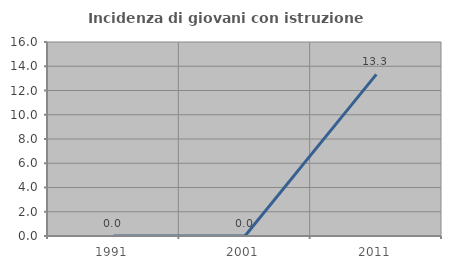
| Category | Incidenza di giovani con istruzione universitaria |
|---|---|
| 1991.0 | 0 |
| 2001.0 | 0 |
| 2011.0 | 13.333 |